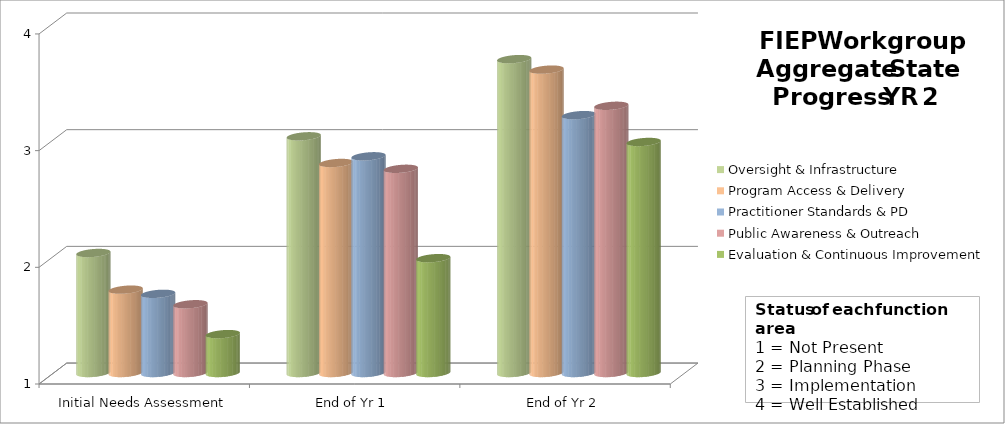
| Category | Oversight & Infrastructure | Program Access & Delivery | Practitioner Standards & PD | Public Awareness & Outreach | Evaluation & Continuous Improvement |
|---|---|---|---|---|---|
| Initial Needs Assessment | 2.029 | 1.714 | 1.679 | 1.589 | 1.333 |
| End of Yr 1 | 3.029 | 2.8 | 2.857 | 2.75 | 1.984 |
| End of Yr 2 | 3.69 | 3.6 | 3.21 | 3.29 | 2.98 |